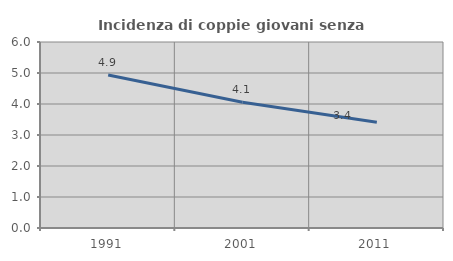
| Category | Incidenza di coppie giovani senza figli |
|---|---|
| 1991.0 | 4.938 |
| 2001.0 | 4.054 |
| 2011.0 | 3.409 |